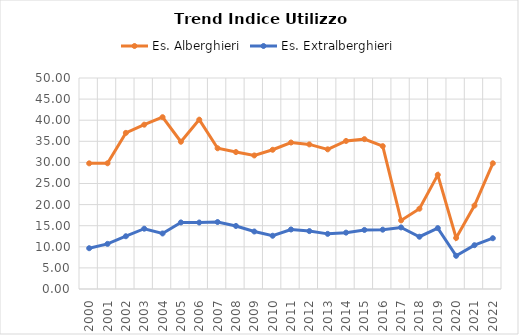
| Category | Es. Alberghieri | Es. Extralberghieri |
|---|---|---|
| 2000.0 | 29.777 | 9.666 |
| 2001.0 | 29.791 | 10.696 |
| 2002.0 | 36.993 | 12.503 |
| 2003.0 | 38.937 | 14.287 |
| 2004.0 | 40.713 | 13.162 |
| 2005.0 | 34.896 | 15.773 |
| 2006.0 | 40.128 | 15.756 |
| 2007.0 | 33.346 | 15.871 |
| 2008.0 | 32.452 | 14.939 |
| 2009.0 | 31.648 | 13.627 |
| 2010.0 | 32.993 | 12.62 |
| 2011.0 | 34.712 | 14.105 |
| 2012.0 | 34.267 | 13.719 |
| 2013.0 | 33.095 | 13.066 |
| 2014.0 | 35.083 | 13.356 |
| 2015.0 | 35.51 | 13.997 |
| 2016.0 | 33.855 | 14.06 |
| 2017.0 | 16.257 | 14.59 |
| 2018.0 | 19.026 | 12.386 |
| 2019.0 | 27.048 | 14.427 |
| 2020.0 | 12.098 | 7.866 |
| 2021.0 | 19.771 | 10.378 |
| 2022.0 | 29.79 | 12.034 |